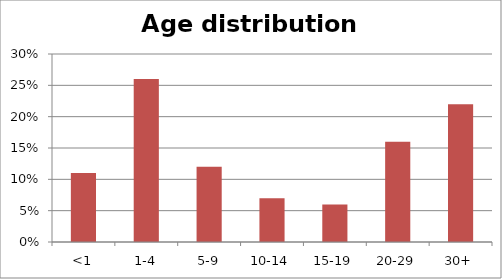
| Category | Age distribution 2018 |
|---|---|
| <1 | 0.11 |
| 1-4 | 0.26 |
| 5-9 | 0.12 |
| 10-14 | 0.07 |
| 15-19 | 0.06 |
| 20-29 | 0.16 |
| 30+ | 0.22 |